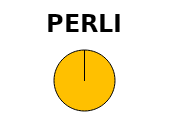
| Category | Series 1 | Series 0 |
|---|---|---|
| Operational Capacity (MW) | 33.996 | 33.996 |
| In progress (MW) | 0 | 0 |